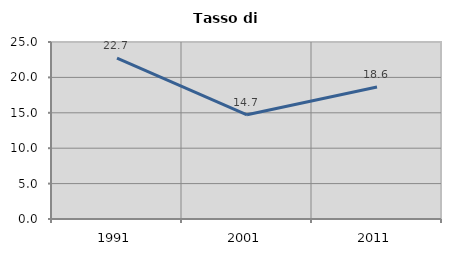
| Category | Tasso di disoccupazione   |
|---|---|
| 1991.0 | 22.738 |
| 2001.0 | 14.716 |
| 2011.0 | 18.632 |